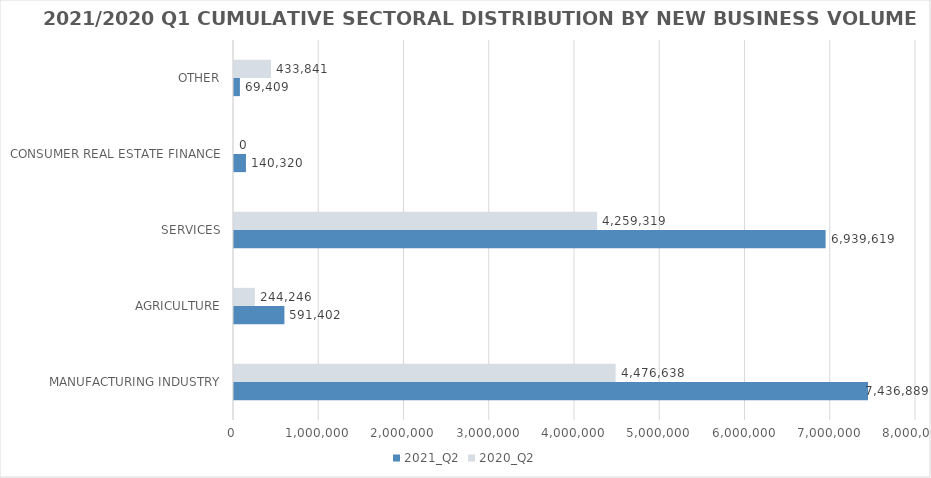
| Category | 2021_Q2 | 2020_Q2 |
|---|---|---|
| MANUFACTURING INDUSTRY | 7436889.296 | 4476638.024 |
| AGRICULTURE | 591401.888 | 244245.607 |
| SERVICES | 6939619.239 | 4259319.308 |
| CONSUMER REAL ESTATE FINANCE | 140320 | 0 |
| OTHER | 69409 | 433841.38 |